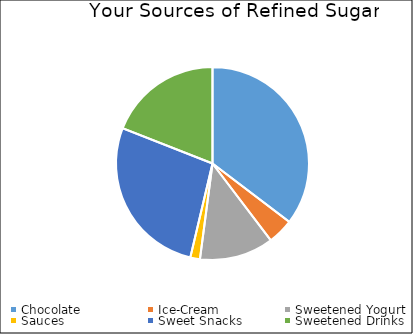
| Category | Series 0 |
|---|---|
| Chocolate | 122.5 |
| Ice-Cream | 15 |
| Sweetened Yogurt | 43 |
| Sauces | 5.6 |
| Sweet Snacks | 94.5 |
| Sweetened Drinks | 66 |